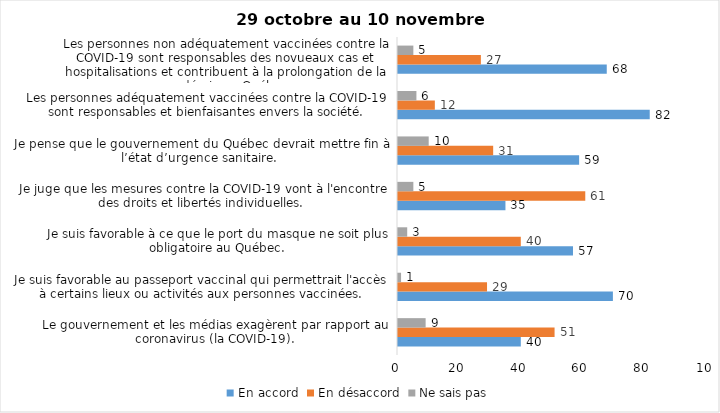
| Category | En accord | En désaccord | Ne sais pas |
|---|---|---|---|
| Le gouvernement et les médias exagèrent par rapport au coronavirus (la COVID-19). | 40 | 51 | 9 |
| Je suis favorable au passeport vaccinal qui permettrait l'accès à certains lieux ou activités aux personnes vaccinées. | 70 | 29 | 1 |
| Je suis favorable à ce que le port du masque ne soit plus obligatoire au Québec. | 57 | 40 | 3 |
| Je juge que les mesures contre la COVID-19 vont à l'encontre des droits et libertés individuelles.  | 35 | 61 | 5 |
| Je pense que le gouvernement du Québec devrait mettre fin à l’état d’urgence sanitaire.  | 59 | 31 | 10 |
| Les personnes adéquatement vaccinées contre la COVID-19 sont responsables et bienfaisantes envers la société. | 82 | 12 | 6 |
| Les personnes non adéquatement vaccinées contre la COVID-19 sont responsables des novueaux cas et hospitalisations et contribuent à la prolongation de la pandémie au Québec. | 68 | 27 | 5 |